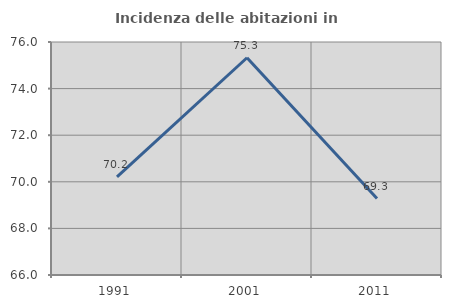
| Category | Incidenza delle abitazioni in proprietà  |
|---|---|
| 1991.0 | 70.213 |
| 2001.0 | 75.325 |
| 2011.0 | 69.281 |